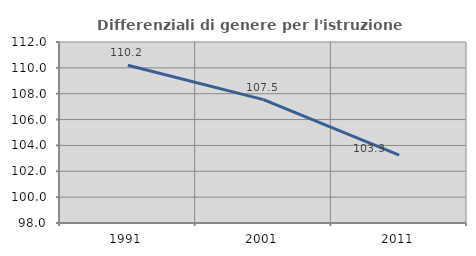
| Category | Differenziali di genere per l'istruzione superiore |
|---|---|
| 1991.0 | 110.205 |
| 2001.0 | 107.542 |
| 2011.0 | 103.252 |